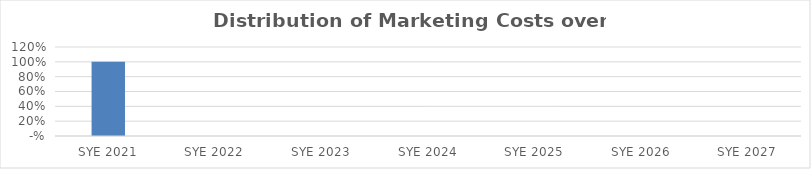
| Category | Series 0 |
|---|---|
| 2021.0 | 1 |
| 2022.0 | 0 |
| 2023.0 | 0 |
| 2024.0 | 0 |
| 2025.0 | 0 |
| 2026.0 | 0 |
| 2027.0 | 0 |